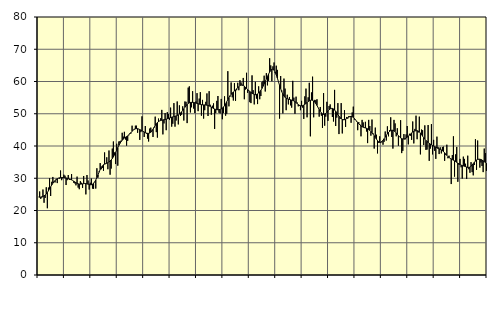
| Category | Piggar | Series 1 |
|---|---|---|
| nan | 24.2 | 24.18 |
| 87.0 | 25.9 | 24.12 |
| 87.0 | 23.6 | 24.15 |
| 87.0 | 24 | 24.26 |
| 87.0 | 26.5 | 24.38 |
| 87.0 | 22.4 | 24.55 |
| 87.0 | 23.9 | 24.78 |
| 87.0 | 27.2 | 25.13 |
| 87.0 | 20.7 | 25.58 |
| 87.0 | 27.1 | 26.12 |
| 87.0 | 30 | 26.71 |
| 87.0 | 24.5 | 27.33 |
| nan | 28.9 | 27.92 |
| 88.0 | 30.4 | 28.46 |
| 88.0 | 28.8 | 28.92 |
| 88.0 | 28.7 | 29.31 |
| 88.0 | 29.8 | 29.62 |
| 88.0 | 28.5 | 29.85 |
| 88.0 | 30 | 30.02 |
| 88.0 | 29.9 | 30.13 |
| 88.0 | 32.4 | 30.19 |
| 88.0 | 29.4 | 30.23 |
| 88.0 | 30 | 30.23 |
| 88.0 | 31.1 | 30.2 |
| nan | 30.8 | 30.16 |
| 89.0 | 27.9 | 30.09 |
| 89.0 | 29.4 | 30 |
| 89.0 | 31 | 29.91 |
| 89.0 | 29.5 | 29.79 |
| 89.0 | 29.5 | 29.66 |
| 89.0 | 31.3 | 29.5 |
| 89.0 | 29.3 | 29.3 |
| 89.0 | 28.6 | 29.08 |
| 89.0 | 28.4 | 28.85 |
| 89.0 | 27.8 | 28.62 |
| 89.0 | 30.5 | 28.43 |
| nan | 27.1 | 28.28 |
| 90.0 | 26.6 | 28.19 |
| 90.0 | 29.1 | 28.17 |
| 90.0 | 28.6 | 28.2 |
| 90.0 | 27 | 28.26 |
| 90.0 | 30.7 | 28.33 |
| 90.0 | 28.4 | 28.37 |
| 90.0 | 25 | 28.34 |
| 90.0 | 31 | 28.27 |
| 90.0 | 29.3 | 28.16 |
| 90.0 | 26.5 | 28.05 |
| 90.0 | 28.6 | 27.97 |
| nan | 29.9 | 27.99 |
| 91.0 | 26.8 | 28.15 |
| 91.0 | 26.7 | 28.45 |
| 91.0 | 28.8 | 28.89 |
| 91.0 | 26.8 | 29.48 |
| 91.0 | 33.1 | 30.2 |
| 91.0 | 30.2 | 31.01 |
| 91.0 | 32.1 | 31.88 |
| 91.0 | 34.7 | 32.71 |
| 91.0 | 32.8 | 33.37 |
| 91.0 | 33.2 | 33.85 |
| 91.0 | 32.3 | 34.18 |
| nan | 38 | 34.37 |
| 92.0 | 34.6 | 34.5 |
| 92.0 | 36.5 | 34.65 |
| 92.0 | 32.8 | 34.82 |
| 92.0 | 38.6 | 35.05 |
| 92.0 | 31.1 | 35.33 |
| 92.0 | 33 | 35.68 |
| 92.0 | 39.2 | 36.1 |
| 92.0 | 41.4 | 36.61 |
| 92.0 | 38 | 37.23 |
| 92.0 | 34.4 | 37.95 |
| 92.0 | 40.7 | 38.73 |
| nan | 33.9 | 39.51 |
| 93.0 | 41.4 | 40.21 |
| 93.0 | 41.5 | 40.83 |
| 93.0 | 41.7 | 41.34 |
| 93.0 | 44.1 | 41.78 |
| 93.0 | 42.9 | 42.15 |
| 93.0 | 44.4 | 42.46 |
| 93.0 | 42 | 42.71 |
| 93.0 | 40.1 | 42.91 |
| 93.0 | 41.6 | 43.14 |
| 93.0 | 43.3 | 43.44 |
| 93.0 | 44 | 43.8 |
| nan | 43.9 | 44.18 |
| 94.0 | 46.3 | 44.58 |
| 94.0 | 45 | 44.92 |
| 94.0 | 45.3 | 45.17 |
| 94.0 | 46.3 | 45.33 |
| 94.0 | 46.3 | 45.39 |
| 94.0 | 44.1 | 45.36 |
| 94.0 | 45.3 | 45.25 |
| 94.0 | 41.9 | 45.09 |
| 94.0 | 44.3 | 44.92 |
| 94.0 | 49.2 | 44.74 |
| 94.0 | 44.6 | 44.54 |
| nan | 42.8 | 44.34 |
| 95.0 | 46.2 | 44.16 |
| 95.0 | 43.8 | 44.01 |
| 95.0 | 42.3 | 43.93 |
| 95.0 | 41.4 | 43.92 |
| 95.0 | 45.4 | 44.02 |
| 95.0 | 45.7 | 44.26 |
| 95.0 | 44.8 | 44.67 |
| 95.0 | 42.8 | 45.19 |
| 95.0 | 45.6 | 45.79 |
| 95.0 | 49.1 | 46.37 |
| 95.0 | 44.3 | 46.88 |
| nan | 42.6 | 47.28 |
| 96.0 | 48.5 | 47.57 |
| 96.0 | 47.8 | 47.76 |
| 96.0 | 48.6 | 47.9 |
| 96.0 | 51.2 | 48 |
| 96.0 | 43.6 | 48.08 |
| 96.0 | 47 | 48.15 |
| 96.0 | 50.2 | 48.22 |
| 96.0 | 44.9 | 48.31 |
| 96.0 | 50.5 | 48.43 |
| 96.0 | 49.9 | 48.55 |
| 96.0 | 48.1 | 48.67 |
| nan | 51.9 | 48.8 |
| 97.0 | 46 | 48.92 |
| 97.0 | 46.9 | 49.03 |
| 97.0 | 53.3 | 49.11 |
| 97.0 | 46 | 49.21 |
| 97.0 | 47.9 | 49.34 |
| 97.0 | 53.8 | 49.48 |
| 97.0 | 46.7 | 49.66 |
| 97.0 | 52.6 | 49.9 |
| 97.0 | 49.3 | 50.22 |
| 97.0 | 49.7 | 50.59 |
| 97.0 | 52.3 | 51.03 |
| nan | 47.9 | 51.52 |
| 98.0 | 53.8 | 52.01 |
| 98.0 | 53.7 | 52.48 |
| 98.0 | 47.1 | 52.89 |
| 98.0 | 58.1 | 53.18 |
| 98.0 | 58.5 | 53.39 |
| 98.0 | 50.4 | 53.5 |
| 98.0 | 52 | 53.53 |
| 98.0 | 57 | 53.53 |
| 98.0 | 51.6 | 53.49 |
| 98.0 | 50.2 | 53.42 |
| 98.0 | 53.8 | 53.33 |
| nan | 56.4 | 53.21 |
| 99.0 | 50.8 | 53.09 |
| 99.0 | 54.7 | 52.98 |
| 99.0 | 56.7 | 52.9 |
| 99.0 | 49.4 | 52.82 |
| 99.0 | 54.3 | 52.76 |
| 99.0 | 48.5 | 52.74 |
| 99.0 | 51.1 | 52.74 |
| 99.0 | 53.7 | 52.72 |
| 99.0 | 56.3 | 52.65 |
| 99.0 | 49.3 | 52.57 |
| 99.0 | 57 | 52.44 |
| nan | 52.8 | 52.26 |
| 0.0 | 49.7 | 52.07 |
| 0.0 | 52.5 | 51.85 |
| 0.0 | 53.2 | 51.63 |
| 0.0 | 45.3 | 51.47 |
| 0.0 | 50.2 | 51.34 |
| 0.0 | 54 | 51.26 |
| 0.0 | 55.5 | 51.24 |
| 0.0 | 50.3 | 51.27 |
| 0.0 | 50.1 | 51.34 |
| 0.0 | 54.6 | 51.49 |
| 0.0 | 48.3 | 51.73 |
| nan | 50.2 | 52.07 |
| 1.0 | 55.4 | 52.53 |
| 1.0 | 49.4 | 53.09 |
| 1.0 | 50 | 53.72 |
| 1.0 | 63.2 | 54.38 |
| 1.0 | 52.3 | 55.03 |
| 1.0 | 55.3 | 55.59 |
| 1.0 | 59.7 | 56.04 |
| 1.0 | 55.1 | 56.41 |
| 1.0 | 54.1 | 56.76 |
| 1.0 | 59.5 | 57.07 |
| 1.0 | 54 | 57.37 |
| nan | 57.3 | 57.7 |
| 2.0 | 59.6 | 58.05 |
| 2.0 | 57.3 | 58.42 |
| 2.0 | 60.4 | 58.74 |
| 2.0 | 59.7 | 58.92 |
| 2.0 | 58.7 | 58.94 |
| 2.0 | 61.1 | 58.81 |
| 2.0 | 54.5 | 58.56 |
| 2.0 | 57.5 | 58.22 |
| 2.0 | 62.7 | 57.85 |
| 2.0 | 56.5 | 57.49 |
| 2.0 | 57.3 | 57.16 |
| nan | 53.6 | 56.87 |
| 3.0 | 53.3 | 56.61 |
| 3.0 | 61.9 | 56.35 |
| 3.0 | 57.3 | 56.13 |
| 3.0 | 52.9 | 55.97 |
| 3.0 | 59.9 | 55.9 |
| 3.0 | 54.7 | 55.97 |
| 3.0 | 53 | 56.14 |
| 3.0 | 58.5 | 56.42 |
| 3.0 | 54.5 | 56.8 |
| 3.0 | 55.5 | 57.27 |
| 3.0 | 59.8 | 57.85 |
| nan | 60.2 | 58.53 |
| 4.0 | 61.8 | 59.28 |
| 4.0 | 56.9 | 60.03 |
| 4.0 | 62.6 | 60.77 |
| 4.0 | 58.8 | 61.54 |
| 4.0 | 60.2 | 62.29 |
| 4.0 | 67.2 | 62.94 |
| 4.0 | 65 | 63.47 |
| 4.0 | 60.1 | 63.79 |
| 4.0 | 64.7 | 63.8 |
| 4.0 | 65.9 | 63.53 |
| 4.0 | 62.6 | 62.95 |
| nan | 64.9 | 62.1 |
| 5.0 | 63.6 | 61.06 |
| 5.0 | 59.9 | 59.93 |
| 5.0 | 48.5 | 58.83 |
| 5.0 | 61.7 | 57.78 |
| 5.0 | 57.2 | 56.85 |
| 5.0 | 50.1 | 56.09 |
| 5.0 | 60.9 | 55.49 |
| 5.0 | 57.8 | 55.07 |
| 5.0 | 51.1 | 54.81 |
| 5.0 | 55.9 | 54.65 |
| 5.0 | 52.9 | 54.55 |
| nan | 55.2 | 54.45 |
| 6.0 | 52.6 | 54.33 |
| 6.0 | 51.9 | 54.22 |
| 6.0 | 60.2 | 54.12 |
| 6.0 | 55 | 53.97 |
| 6.0 | 50 | 53.74 |
| 6.0 | 55.3 | 53.47 |
| 6.0 | 53.5 | 53.15 |
| 6.0 | 52.3 | 52.85 |
| 6.0 | 52.4 | 52.63 |
| 6.0 | 51.1 | 52.48 |
| 6.0 | 54 | 52.44 |
| nan | 51.9 | 52.52 |
| 7.0 | 48.4 | 52.7 |
| 7.0 | 55.4 | 52.94 |
| 7.0 | 57.8 | 53.22 |
| 7.0 | 48.9 | 53.48 |
| 7.0 | 55.1 | 53.75 |
| 7.0 | 59.6 | 53.99 |
| 7.0 | 43 | 54.16 |
| 7.0 | 56.6 | 54.23 |
| 7.0 | 61.5 | 54.16 |
| 7.0 | 48.9 | 53.96 |
| 7.0 | 54.3 | 53.61 |
| nan | 54.2 | 53.13 |
| 8.0 | 54.5 | 52.57 |
| 8.0 | 52 | 51.95 |
| 8.0 | 49.1 | 51.3 |
| 8.0 | 52.1 | 50.71 |
| 8.0 | 49.4 | 50.27 |
| 8.0 | 45.6 | 49.96 |
| 8.0 | 56.4 | 49.83 |
| 8.0 | 46.3 | 49.93 |
| 8.0 | 49.1 | 50.14 |
| 8.0 | 53.7 | 50.46 |
| 8.0 | 47.8 | 50.86 |
| nan | 52.4 | 51.23 |
| 9.0 | 52.9 | 51.51 |
| 9.0 | 51.6 | 51.66 |
| 9.0 | 49 | 51.65 |
| 9.0 | 47.6 | 51.49 |
| 9.0 | 57.4 | 51.18 |
| 9.0 | 46.2 | 50.77 |
| 9.0 | 48.8 | 50.28 |
| 9.0 | 53.3 | 49.74 |
| 9.0 | 43.7 | 49.24 |
| 9.0 | 48.4 | 48.82 |
| 9.0 | 53.3 | 48.47 |
| nan | 43.9 | 48.24 |
| 10.0 | 48.3 | 48.13 |
| 10.0 | 51.1 | 48.16 |
| 10.0 | 45.9 | 48.31 |
| 10.0 | 49 | 48.54 |
| 10.0 | 48.5 | 48.77 |
| 10.0 | 49.3 | 48.98 |
| 10.0 | 49.2 | 49.14 |
| 10.0 | 47.2 | 49.17 |
| 10.0 | 50.4 | 49.08 |
| 10.0 | 52.2 | 48.87 |
| 10.0 | 48.2 | 48.53 |
| nan | 48.2 | 48.12 |
| 11.0 | 47.6 | 47.71 |
| 11.0 | 44.9 | 47.29 |
| 11.0 | 47.4 | 46.88 |
| 11.0 | 46.7 | 46.53 |
| 11.0 | 43 | 46.21 |
| 11.0 | 48.1 | 45.99 |
| 11.0 | 47.3 | 45.83 |
| 11.0 | 45.6 | 45.7 |
| 11.0 | 47.5 | 45.61 |
| 11.0 | 44.5 | 45.5 |
| 11.0 | 40.9 | 45.34 |
| nan | 48.1 | 45.13 |
| 12.0 | 46.2 | 44.85 |
| 12.0 | 43.2 | 44.51 |
| 12.0 | 48.2 | 44.12 |
| 12.0 | 43.9 | 43.67 |
| 12.0 | 39.2 | 43.18 |
| 12.0 | 45.7 | 42.66 |
| 12.0 | 43.5 | 42.15 |
| 12.0 | 37.7 | 41.68 |
| 12.0 | 41 | 41.32 |
| 12.0 | 43 | 41.12 |
| 12.0 | 40.9 | 41.16 |
| nan | 41.2 | 41.4 |
| 13.0 | 40.4 | 41.78 |
| 13.0 | 41.3 | 42.25 |
| 13.0 | 44.5 | 42.76 |
| 13.0 | 41.7 | 43.28 |
| 13.0 | 46.1 | 43.79 |
| 13.0 | 43 | 44.21 |
| 13.0 | 44.9 | 44.53 |
| 13.0 | 48.9 | 44.77 |
| 13.0 | 42.8 | 44.9 |
| 13.0 | 39.2 | 44.88 |
| 13.0 | 48.1 | 44.72 |
| nan | 47 | 44.43 |
| 14.0 | 43 | 44.04 |
| 14.0 | 45.5 | 43.62 |
| 14.0 | 40.1 | 43.19 |
| 14.0 | 42.8 | 42.82 |
| 14.0 | 48 | 42.51 |
| 14.0 | 37.8 | 42.29 |
| 14.0 | 38.5 | 42.19 |
| 14.0 | 43.7 | 42.17 |
| 14.0 | 42 | 42.26 |
| 14.0 | 43.6 | 42.47 |
| 14.0 | 46.2 | 42.74 |
| nan | 40.5 | 43.05 |
| 15.0 | 43.8 | 43.39 |
| 15.0 | 43.2 | 43.73 |
| 15.0 | 41.9 | 44.05 |
| 15.0 | 47.6 | 44.32 |
| 15.0 | 40.8 | 44.52 |
| 15.0 | 45.3 | 44.66 |
| 15.0 | 49.4 | 44.74 |
| 15.0 | 42.1 | 44.74 |
| 15.0 | 44.2 | 44.63 |
| 15.0 | 49.1 | 44.38 |
| 15.0 | 37.4 | 44.01 |
| nan | 45.1 | 43.54 |
| 16.0 | 44.9 | 43.05 |
| 16.0 | 40.3 | 42.58 |
| 16.0 | 46.4 | 42.14 |
| 16.0 | 38.8 | 41.75 |
| 16.0 | 38.9 | 41.41 |
| 16.0 | 46.5 | 41.11 |
| 16.0 | 35.4 | 40.85 |
| 16.0 | 39.2 | 40.6 |
| 16.0 | 46.8 | 40.37 |
| 16.0 | 37.4 | 40.17 |
| 16.0 | 41.9 | 39.98 |
| nan | 38.5 | 39.82 |
| 17.0 | 36 | 39.64 |
| 17.0 | 42.9 | 39.44 |
| 17.0 | 39.7 | 39.25 |
| 17.0 | 37.5 | 39.09 |
| 17.0 | 39.6 | 38.96 |
| 17.0 | 37.7 | 38.79 |
| 17.0 | 39.7 | 38.55 |
| 17.0 | 39.8 | 38.27 |
| 17.0 | 35.4 | 37.9 |
| 17.0 | 37.2 | 37.49 |
| 17.0 | 40.4 | 37.09 |
| nan | 36.2 | 36.73 |
| 18.0 | 37 | 36.43 |
| 18.0 | 36.2 | 36.2 |
| 18.0 | 28.2 | 35.99 |
| 18.0 | 37.2 | 35.79 |
| 18.0 | 43 | 35.59 |
| 18.0 | 30.5 | 35.39 |
| 18.0 | 37.4 | 35.18 |
| 18.0 | 39.7 | 34.94 |
| 18.0 | 28.9 | 34.71 |
| 18.0 | 34.2 | 34.49 |
| 18.0 | 36 | 34.27 |
| nan | 33.4 | 34.08 |
| 19.0 | 29.9 | 33.94 |
| 19.0 | 36.7 | 33.81 |
| 19.0 | 36 | 33.71 |
| 19.0 | 34.5 | 33.6 |
| 19.0 | 29.8 | 33.47 |
| 19.0 | 37 | 33.36 |
| 19.0 | 32.8 | 33.35 |
| 19.0 | 31.7 | 33.46 |
| 19.0 | 35 | 33.71 |
| 19.0 | 31.9 | 34.1 |
| 19.0 | 30.9 | 34.52 |
| nan | 34.1 | 34.95 |
| 20.0 | 42.1 | 35.34 |
| 20.0 | 32.6 | 35.65 |
| 20.0 | 41.7 | 35.84 |
| 20.0 | 35.8 | 35.92 |
| 20.0 | 33.3 | 35.9 |
| 20.0 | 34.9 | 35.81 |
| 20.0 | 33.8 | 35.63 |
| 20.0 | 31.9 | 35.4 |
| 20.0 | 39.2 | 35.15 |
| 20.0 | 37.8 | 34.9 |
| 20.0 | 32.3 | 34.64 |